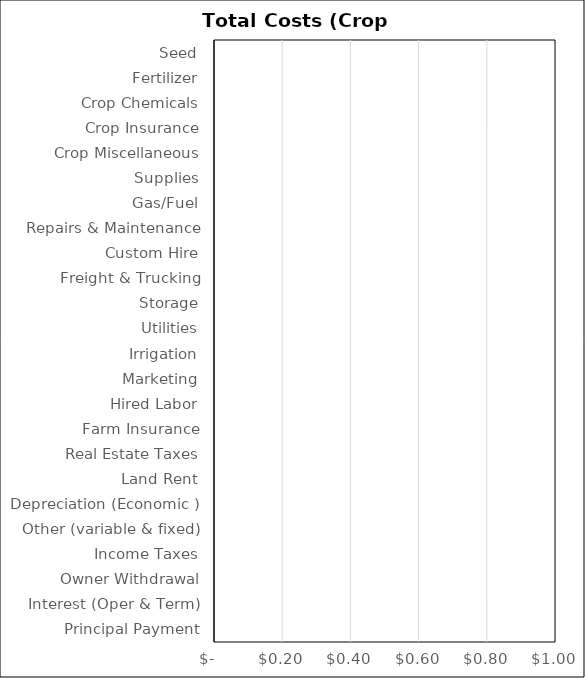
| Category | Corn |
|---|---|
| Seed | 0 |
| Fertilizer | 0 |
| Crop Chemicals | 0 |
| Crop Insurance | 0 |
| Crop Miscellaneous | 0 |
| Supplies | 0 |
| Gas/Fuel | 0 |
| Repairs & Maintenance | 0 |
| Custom Hire | 0 |
| Freight & Trucking | 0 |
| Storage | 0 |
| Utilities | 0 |
| Irrigation | 0 |
| Marketing | 0 |
| Hired Labor | 0 |
| Farm Insurance | 0 |
| Real Estate Taxes | 0 |
| Land Rent | 0 |
| Depreciation (Economic ) | 0 |
| Other (variable & fixed) | 0 |
| Income Taxes | 0 |
| Owner Withdrawal | 0 |
| Interest (Oper & Term) | 0 |
| Principal Payment | 0 |